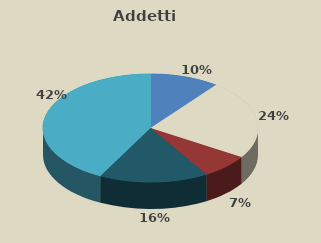
| Category | Series 0 | Series 1 |
|---|---|---|
| AGRICOLTURA | 15253 | 107893 |
| INDUSTRIA | 34747 | 488882 |
| COSTRUZIONI | 10745 | 131093 |
| COMMERCIO | 24065 | 287577 |
| ALTRI SERVIZI | 62230 | 634281 |